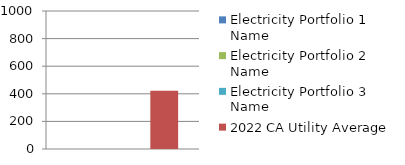
| Category | Electricity Portfolio 1 Name | Electricity Portfolio 2 Name | Electricity Portfolio 3 Name | 2022 CA Utility Average |
|---|---|---|---|---|
| 0 | 0 | 0 | 0 | 422 |